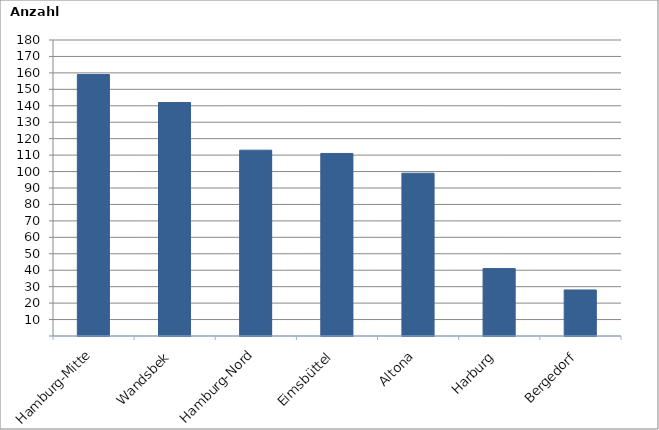
| Category | Series 0 |
|---|---|
| Hamburg-Mitte | 159 |
| Wandsbek | 142 |
| Hamburg-Nord | 113 |
| Eimsbüttel | 111 |
| Altona | 99 |
| Harburg | 41 |
| Bergedorf | 28 |